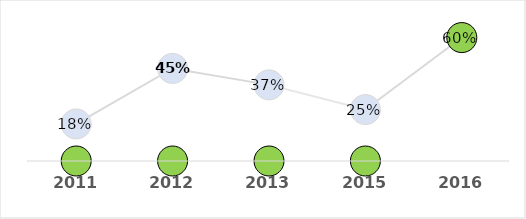
| Category | Attrition % |
|---|---|
| 2011.0 | 0.18 |
| 2012.0 | 0.45 |
| 2013.0 | 0.37 |
| 2015.0 | 0.25 |
| 2016.0 | 0.6 |